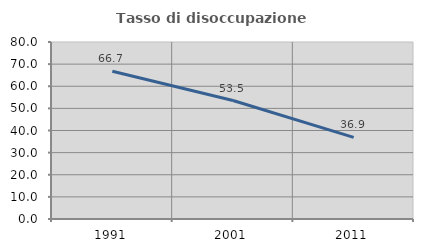
| Category | Tasso di disoccupazione giovanile  |
|---|---|
| 1991.0 | 66.747 |
| 2001.0 | 53.535 |
| 2011.0 | 36.879 |